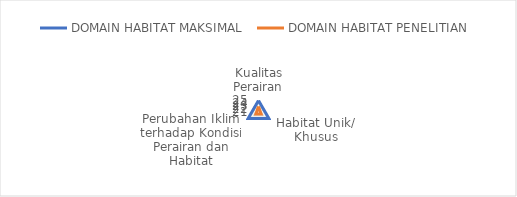
| Category | DOMAIN HABITAT MAKSIMAL  | DOMAIN HABITAT PENELITIAN  |
|---|---|---|
| Kualitas Perairan | 25 | 23 |
| Habitat Unik/ Khusus | 25 | 22 |
| Perubahan Iklim terhadap Kondisi Perairan dan Habitat | 25 | 22 |